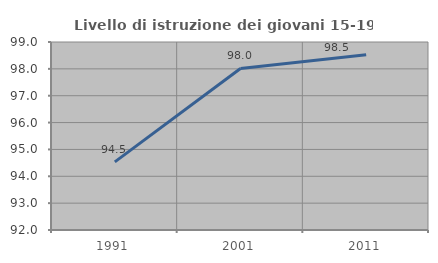
| Category | Livello di istruzione dei giovani 15-19 anni |
|---|---|
| 1991.0 | 94.537 |
| 2001.0 | 98.014 |
| 2011.0 | 98.526 |